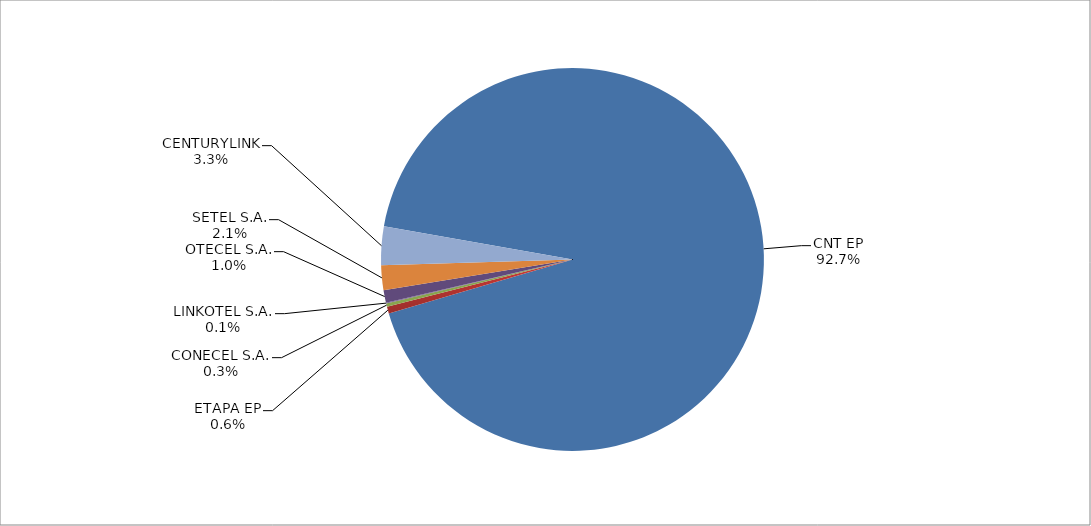
| Category | Series 0 |
|---|---|
| CNT EP | 2894 |
| ETAPA EP | 18 |
| CONECEL S.A. | 9 |
| LINKOTEL S.A. | 2 |
| OTECEL S.A. | 33 |
| SETEL S.A. | 65 |
| CENTURYLINK | 102 |